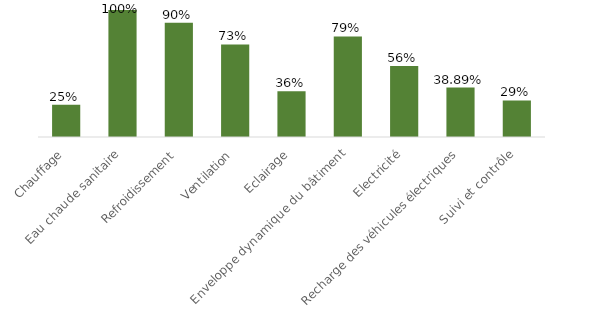
| Category | Series 0 | Series 4 | Series 1 | Series 2 | Series 3 |
|---|---|---|---|---|---|
| Chauffage |  |  |  |  | 0.254 |
| Eau chaude sanitaire |  |  |  |  | 1 |
| Refroidissement |  |  |  |  | 0.9 |
| Ventilation |  |  |  |  | 0.729 |
| Eclairage |  |  |  |  | 0.36 |
| Enveloppe dynamique du bâtiment |  |  |  |  | 0.792 |
| Electricité |  |  |  |  | 0.56 |
| Recharge des véhicules électriques |  |  |  |  | 0.389 |
| Suivi et contrôle |  |  |  |  | 0.288 |